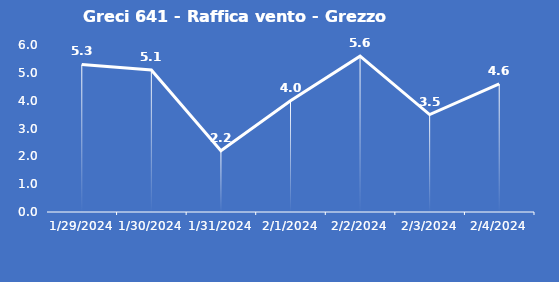
| Category | Greci 641 - Raffica vento - Grezzo (m/s) |
|---|---|
| 1/29/24 | 5.3 |
| 1/30/24 | 5.1 |
| 1/31/24 | 2.2 |
| 2/1/24 | 4 |
| 2/2/24 | 5.6 |
| 2/3/24 | 3.5 |
| 2/4/24 | 4.6 |